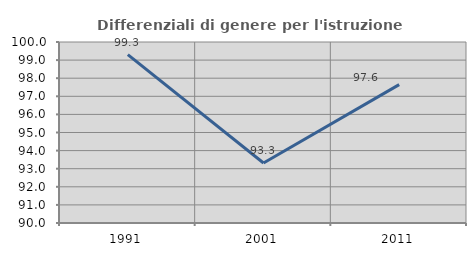
| Category | Differenziali di genere per l'istruzione superiore |
|---|---|
| 1991.0 | 99.306 |
| 2001.0 | 93.314 |
| 2011.0 | 97.647 |